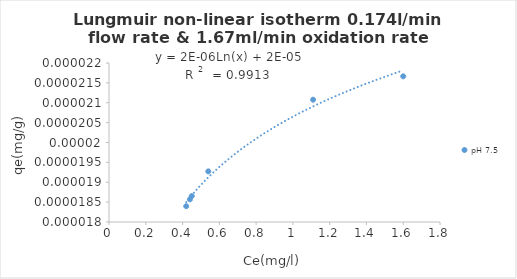
| Category | pH 7.5 |
|---|---|
| 1.6 | 0 |
| 1.11 | 0 |
| 0.54 | 0 |
| 0.44 | 0 |
| 0.45 | 0 |
| 0.42 | 0 |